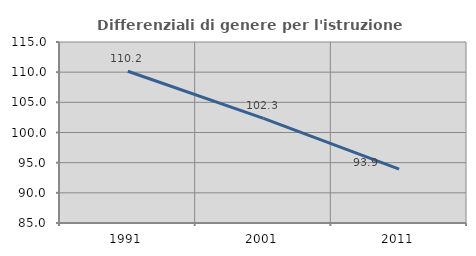
| Category | Differenziali di genere per l'istruzione superiore |
|---|---|
| 1991.0 | 110.154 |
| 2001.0 | 102.33 |
| 2011.0 | 93.941 |